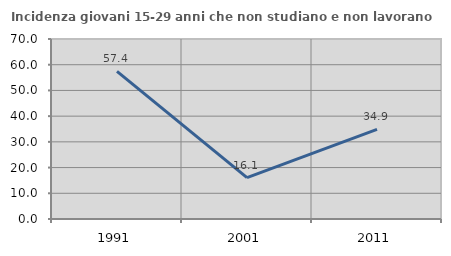
| Category | Incidenza giovani 15-29 anni che non studiano e non lavorano  |
|---|---|
| 1991.0 | 57.41 |
| 2001.0 | 16.071 |
| 2011.0 | 34.884 |